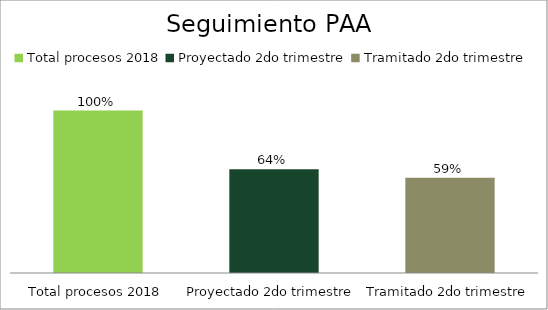
| Category | Series 0 |
|---|---|
| Total procesos 2018 | 1 |
| Proyectado 2do trimestre | 0.639 |
| Tramitado 2do trimestre | 0.587 |